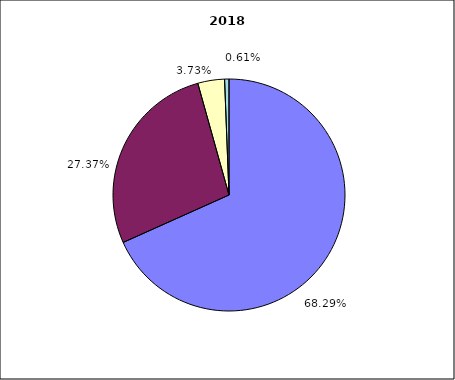
| Category | 2018 |
|---|---|
| Salarissen | 8050147 |
| Werking | 3226557.857 |
| Investeringen | 439170 |
| Andere | 71949.765 |